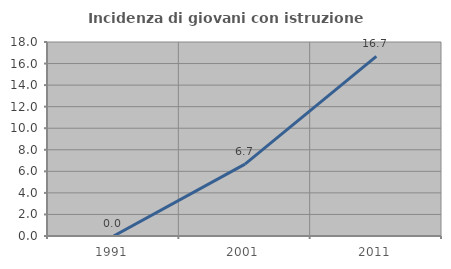
| Category | Incidenza di giovani con istruzione universitaria |
|---|---|
| 1991.0 | 0 |
| 2001.0 | 6.667 |
| 2011.0 | 16.667 |